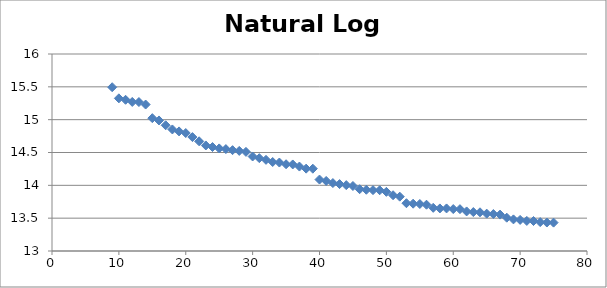
| Category | Natural Log Y |
|---|---|
| 9.0 | 15.494 |
| 10.0 | 15.325 |
| 11.0 | 15.303 |
| 12.0 | 15.27 |
| 13.0 | 15.268 |
| 14.0 | 15.23 |
| 15.0 | 15.023 |
| 16.0 | 14.988 |
| 17.0 | 14.914 |
| 18.0 | 14.851 |
| 19.0 | 14.821 |
| 20.0 | 14.797 |
| 21.0 | 14.734 |
| 22.0 | 14.67 |
| 23.0 | 14.607 |
| 24.0 | 14.583 |
| 25.0 | 14.562 |
| 26.0 | 14.552 |
| 27.0 | 14.536 |
| 28.0 | 14.524 |
| 29.0 | 14.51 |
| 30.0 | 14.439 |
| 31.0 | 14.414 |
| 32.0 | 14.388 |
| 33.0 | 14.355 |
| 34.0 | 14.347 |
| 35.0 | 14.321 |
| 36.0 | 14.318 |
| 37.0 | 14.286 |
| 38.0 | 14.254 |
| 39.0 | 14.253 |
| 40.0 | 14.088 |
| 41.0 | 14.067 |
| 42.0 | 14.034 |
| 43.0 | 14.019 |
| 44.0 | 14.003 |
| 45.0 | 13.99 |
| 46.0 | 13.941 |
| 47.0 | 13.933 |
| 48.0 | 13.927 |
| 49.0 | 13.925 |
| 50.0 | 13.901 |
| 51.0 | 13.849 |
| 52.0 | 13.827 |
| 53.0 | 13.728 |
| 54.0 | 13.72 |
| 55.0 | 13.716 |
| 56.0 | 13.705 |
| 57.0 | 13.658 |
| 58.0 | 13.648 |
| 59.0 | 13.648 |
| 60.0 | 13.639 |
| 61.0 | 13.637 |
| 62.0 | 13.603 |
| 63.0 | 13.593 |
| 64.0 | 13.59 |
| 65.0 | 13.569 |
| 66.0 | 13.563 |
| 67.0 | 13.554 |
| 68.0 | 13.507 |
| 69.0 | 13.481 |
| 70.0 | 13.474 |
| 71.0 | 13.458 |
| 72.0 | 13.457 |
| 73.0 | 13.44 |
| 74.0 | 13.434 |
| 75.0 | 13.432 |